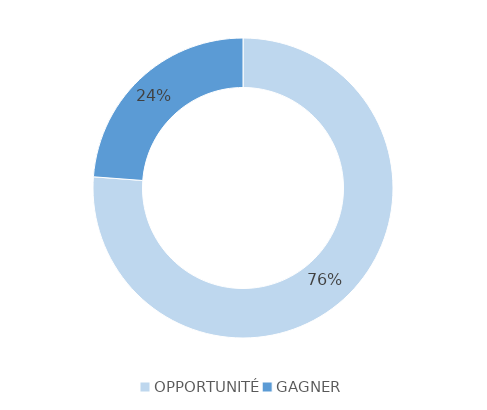
| Category | Series 0 |
|---|---|
| OPPORTUNITÉ | 16 |
| GAGNER | 5 |